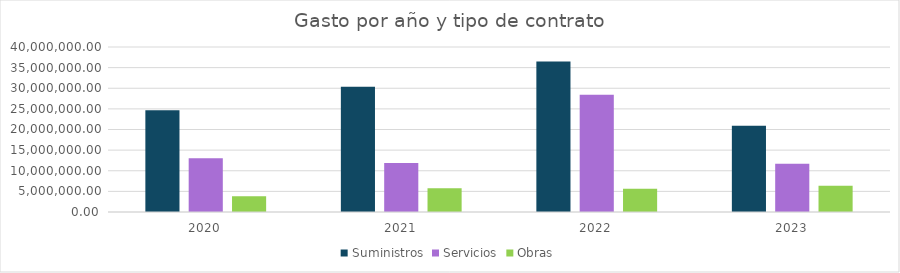
| Category | Suministros | Servicios | Obras |
|---|---|---|---|
| 2020.0 | 24678071.45 | 13052032.47 | 3837926.07 |
| 2021.0 | 30338135.174 | 11891193.79 | 5728014.1 |
| 2022.0 | 36459005.47 | 28405112.431 | 5653635.53 |
| 2023.0 | 20920257.255 | 11677718.661 | 6353096.52 |